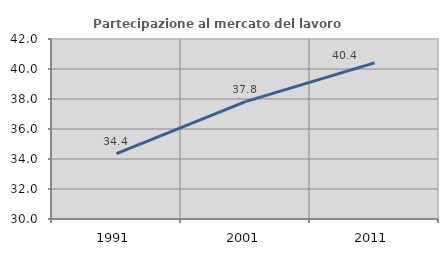
| Category | Partecipazione al mercato del lavoro  femminile |
|---|---|
| 1991.0 | 34.363 |
| 2001.0 | 37.825 |
| 2011.0 | 40.41 |